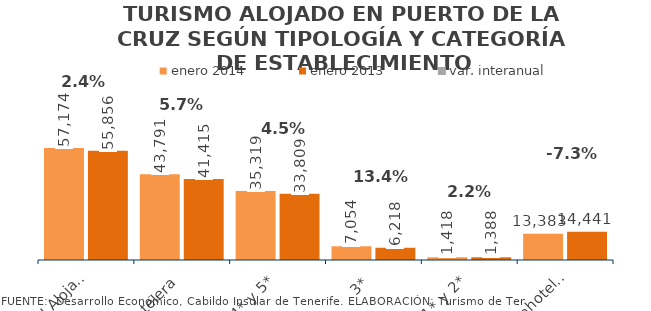
| Category | enero 2014 | enero 2013 |
|---|---|---|
| Total Alojados | 57174 | 55856 |
| Hotelera | 43791 | 41415 |
| 4* y 5* | 35319 | 33809 |
| 3* | 7054 | 6218 |
| 1* y 2* | 1418 | 1388 |
| Extrahotelera | 13383 | 14441 |